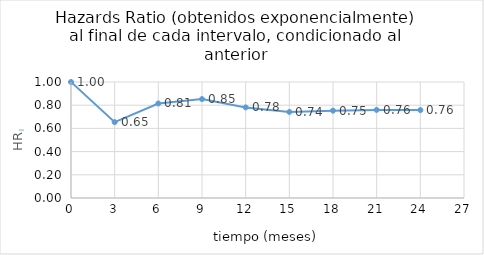
| Category | HRi |
|---|---|
| 0.0 | 1 |
| 3.0 | 0.654 |
| 6.0 | 0.815 |
| 9.0 | 0.853 |
| 12.0 | 0.781 |
| 15.0 | 0.742 |
| 18.0 | 0.753 |
| 21.0 | 0.76 |
| 24.0 | 0.758 |